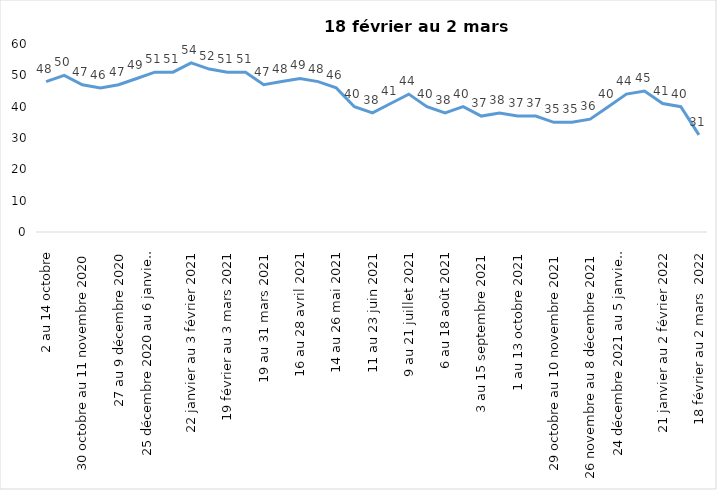
| Category | Toujours aux trois mesures |
|---|---|
| 2 au 14 octobre | 48 |
| 16 au 28 octobre 2020 | 50 |
| 30 octobre au 11 novembre 2020 | 47 |
| 13 au 25 novembre 2020 | 46 |
| 27 au 9 décembre 2020 | 47 |
| 11 au 25 décembre 2020 | 49 |
| 25 décembre 2020 au 6 janvier 2021 | 51 |
| 8 au 20 janvier 2021 | 51 |
| 22 janvier au 3 février 2021 | 54 |
| 5 au 17 février 2021 | 52 |
| 19 février au 3 mars 2021 | 51 |
| 5 au 17 mars 2021 | 51 |
| 19 au 31 mars 2021 | 47 |
| 2 au 14 avril 2021 | 48 |
| 16 au 28 avril 2021 | 49 |
| 30 avril au 12 mai 2021 | 48 |
| 14 au 26 mai 2021 | 46 |
| 28 mai au 9 juin 2021 | 40 |
| 11 au 23 juin 2021 | 38 |
| 25 juin au 7 juillet 2021 | 41 |
| 9 au 21 juillet 2021 | 44 |
| 23 au 4 août 2021 | 40 |
| 6 au 18 août 2021 | 38 |
| 20 août au 1er septembre 2021 | 40 |
| 3 au 15 septembre 2021 | 37 |
| 17 au 29 septembre 2021 | 38 |
| 1 au 13 octobre 2021 | 37 |
| 15 au 27 octobre 2021 | 37 |
| 29 octobre au 10 novembre 2021 | 35 |
| 12 au 24 novembre 2021 | 35 |
| 26 novembre au 8 décembre 2021 | 36 |
| 10 au 22 décembre 2021 | 40 |
| 24 décembre 2021 au 5 janvier 2022 | 44 |
| 7 au 19 janvier 2022 | 45 |
| 21 janvier au 2 février 2022 | 41 |
| 4 au 16 février 2022 | 40 |
| 18 février au 2 mars  2022 | 31 |